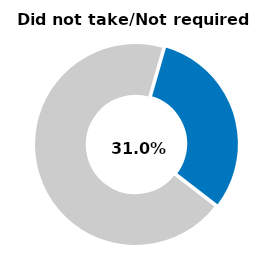
| Category | Series 0 |
|---|---|
| Did not take/not required | 0.31 |
| Other | 0.69 |